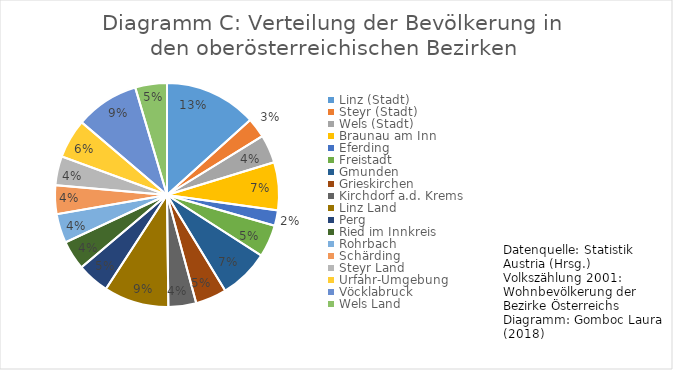
| Category | Bevölkerungszahl |
|---|---|
| Linz (Stadt) | 183504 |
| Steyr (Stadt) | 39340 |
| Wels (Stadt) | 56478 |
| Braunau am Inn | 95189 |
| Eferding | 30718 |
| Freistadt | 64008 |
| Gmunden | 99355 |
| Grieskirchen | 61960 |
| Kirchdorf a.d. Krems | 55167 |
| Linz Land | 129059 |
| Perg | 63955 |
| Ried im Innkreis  | 58203 |
| Rohrbach | 57909 |
| Schärding | 56996 |
| Steyr Land | 57611 |
| Urfahr-Umgebung | 77742 |
| Vöcklabruck | 126599 |
| Wels Land | 63004 |